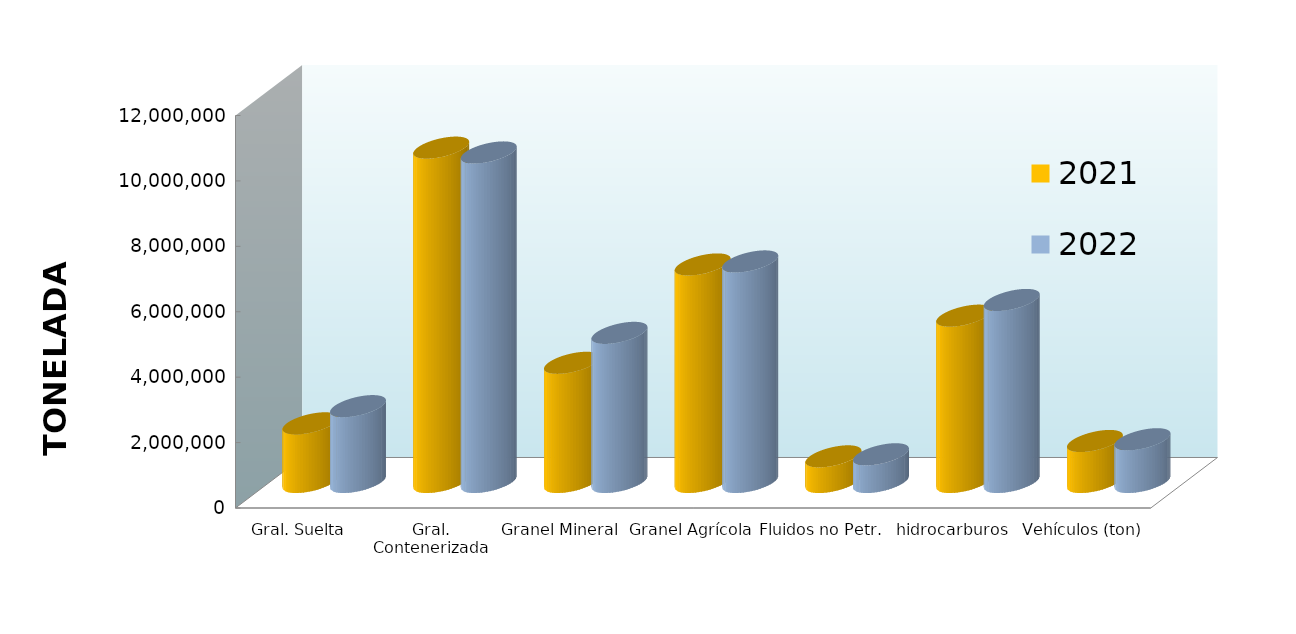
| Category | 2021 | 2022 |
|---|---|---|
| Gral. Suelta | 1793650.319 | 2318942.359 |
| Gral. Contenerizada | 10222229.005 | 10075479.299 |
| Granel Mineral | 3644020.991 | 4559147.913 |
| Granel Agrícola | 6651017.178 | 6743640.593 |
| Fluidos no Petr. | 783753.543 | 847480.741 |
| hidrocarburos | 5085286.474 | 5565042.593 |
| Vehículos (ton) | 1253881.507 | 1307112.915 |